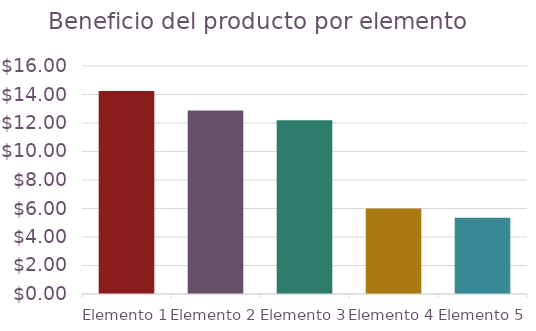
| Category | Beneficio por elemento 
(con envío) |
|---|---|
| Elemento 1 | 14.25 |
| Elemento 2 | 12.875 |
| Elemento 3 | 12.2 |
| Elemento 4 | 6 |
| Elemento 5 | 5.35 |